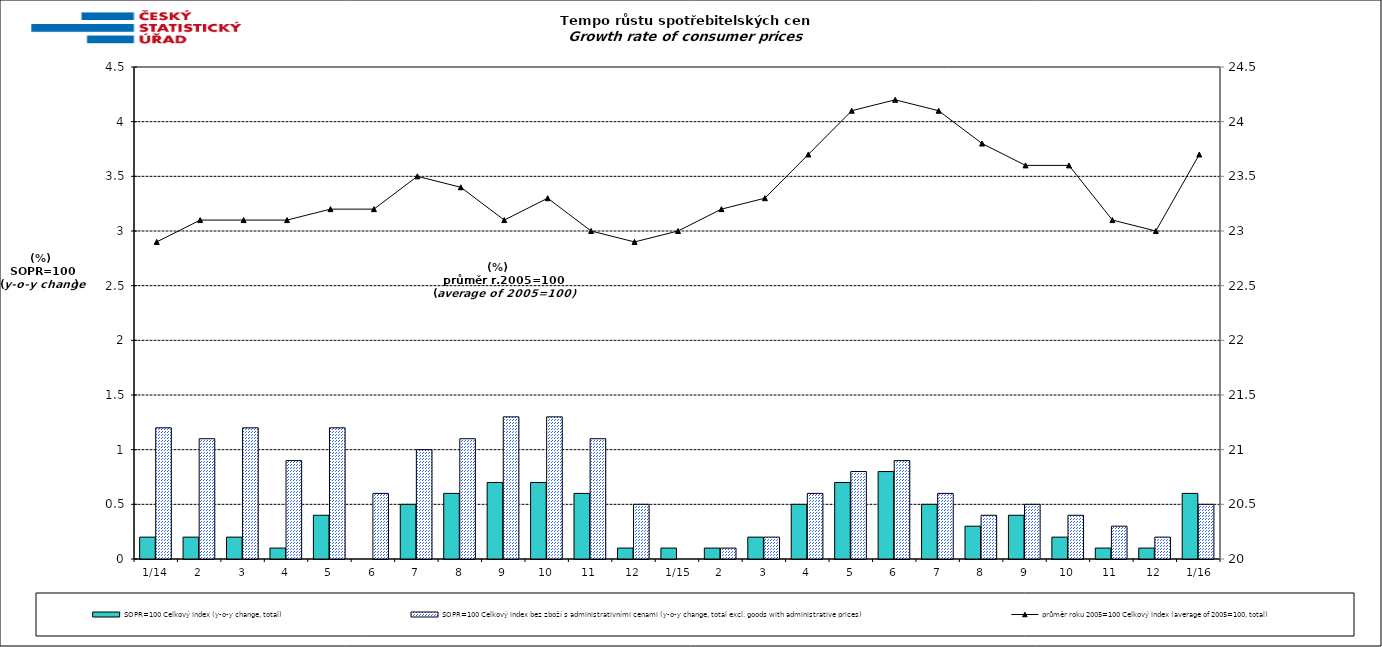
| Category | SOPR=100 Celkový index (y-o-y change, total) | SOPR=100 Celkový index bez zboží s administrativními cenami (y-o-y change, total excl. goods with administrative prices)  |
|---|---|---|
| 1/14 | 0.2 | 1.2 |
| 2 | 0.2 | 1.1 |
| 3 | 0.2 | 1.2 |
| 4 | 0.1 | 0.9 |
| 5 | 0.4 | 1.2 |
| 6 | 0 | 0.6 |
| 7 | 0.5 | 1 |
| 8 | 0.6 | 1.1 |
| 9 | 0.7 | 1.3 |
| 10 | 0.7 | 1.3 |
| 11 | 0.6 | 1.1 |
| 12 | 0.1 | 0.5 |
|  1/15 | 0.1 | 0 |
| 2 | 0.1 | 0.1 |
| 3 | 0.2 | 0.2 |
| 4 | 0.5 | 0.6 |
| 5 | 0.7 | 0.8 |
| 6 | 0.8 | 0.9 |
| 7 | 0.5 | 0.6 |
| 8 | 0.3 | 0.4 |
| 9 | 0.4 | 0.5 |
| 10 | 0.2 | 0.4 |
| 11 | 0.1 | 0.3 |
| 12 | 0.1 | 0.2 |
|  1/16 | 0.6 | 0.5 |